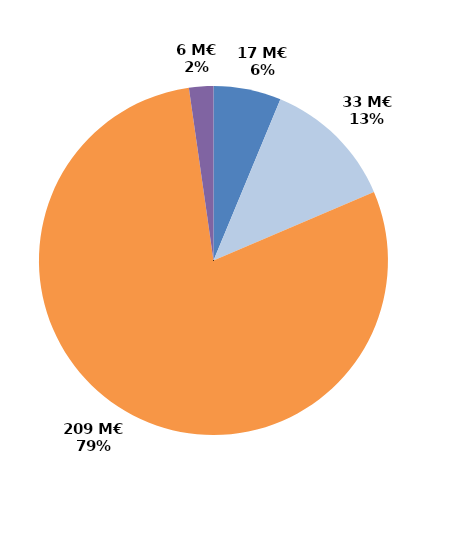
| Category | Series 0 |
|---|---|
| CIF - CPF | 16.57 |
| Période de professionnalisation | 32.545 |
| Plan de formation | 209.44 |
| Autres | 5.97 |